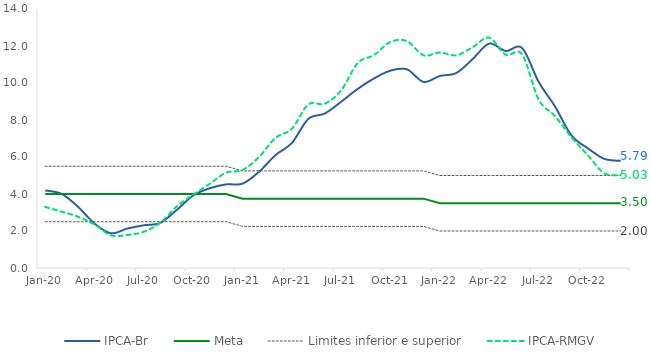
| Category | IPCA-Br | Meta | Limites inferior e superior | Limite superior | IPCA-RMGV |
|---|---|---|---|---|---|
| 2020-01-01 | 4.192 | 4 | 2.5 | 5.5 | 3.302 |
| 2020-02-01 | 4.005 | 4 | 2.5 | 5.5 | 3.046 |
| 2020-03-01 | 3.303 | 4 | 2.5 | 5.5 | 2.769 |
| 2020-04-01 | 2.399 | 4 | 2.5 | 5.5 | 2.349 |
| 2020-05-01 | 1.877 | 4 | 2.5 | 5.5 | 1.766 |
| 2020-06-01 | 2.132 | 4 | 2.5 | 5.5 | 1.786 |
| 2020-07-01 | 2.31 | 4 | 2.5 | 5.5 | 1.96 |
| 2020-08-01 | 2.44 | 4 | 2.5 | 5.5 | 2.45 |
| 2020-09-01 | 3.14 | 4 | 2.5 | 5.5 | 3.33 |
| 2020-10-01 | 3.92 | 4 | 2.5 | 5.5 | 3.96 |
| 2020-11-01 | 4.31 | 4 | 2.5 | 5.5 | 4.55 |
| 2020-12-01 | 4.52 | 4 | 2.5 | 5.5 | 5.15 |
| 2021-01-01 | 4.56 | 3.75 | 2.25 | 5.25 | 5.3 |
| 2021-02-01 | 5.2 | 3.75 | 2.25 | 5.25 | 6 |
| 2021-03-01 | 6.1 | 3.75 | 2.25 | 5.25 | 7.03 |
| 2021-04-01 | 6.76 | 3.75 | 2.25 | 5.25 | 7.53 |
| 2021-05-01 | 8.06 | 3.75 | 2.25 | 5.25 | 8.84 |
| 2021-06-01 | 8.35 | 3.75 | 2.25 | 5.25 | 8.88 |
| 2021-07-01 | 8.99 | 3.75 | 2.25 | 5.25 | 9.61 |
| 2021-08-01 | 9.68 | 3.75 | 2.25 | 5.25 | 11.07 |
| 2021-09-01 | 10.25 | 3.75 | 2.25 | 5.25 | 11.52 |
| 2021-10-01 | 10.67 | 3.75 | 2.25 | 5.25 | 12.22 |
| 2021-11-01 | 10.74 | 3.75 | 2.25 | 5.25 | 12.26 |
| 2021-12-01 | 10.06 | 3.75 | 2.25 | 5.25 | 11.5 |
| 2022-01-01 | 10.38 | 3.5 | 2 | 5 | 11.65 |
| 2022-02-01 | 10.54 | 3.5 | 2 | 5 | 11.5 |
| 2022-03-01 | 11.3 | 3.5 | 2 | 5 | 11.94 |
| 2022-04-01 | 12.13 | 3.5 | 2 | 5 | 12.45 |
| 2022-05-01 | 11.73 | 3.5 | 2 | 5 | 11.53 |
| 2022-06-01 | 11.89 | 3.5 | 2 | 5 | 11.55 |
| 2022-07-01 | 10.07 | 3.5 | 2 | 5 | 9.12 |
| 2022-08-01 | 8.73 | 3.5 | 2 | 5 | 8.21 |
| 2022-09-01 | 7.17 | 3.5 | 2 | 5 | 7.07 |
| 2022-10-01 | 6.47 | 3.5 | 2 | 5 | 6.09 |
| 2022-11-01 | 5.9 | 3.5 | 2 | 5 | 5.12 |
| 2022-12-01 | 5.79 | 3.5 | 2 | 5 | 5.03 |